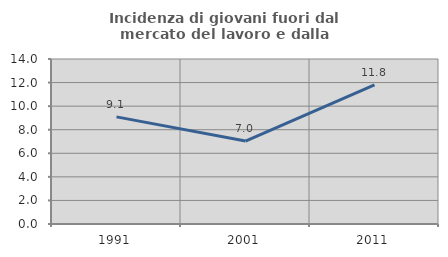
| Category | Incidenza di giovani fuori dal mercato del lavoro e dalla formazione  |
|---|---|
| 1991.0 | 9.091 |
| 2001.0 | 7.037 |
| 2011.0 | 11.798 |